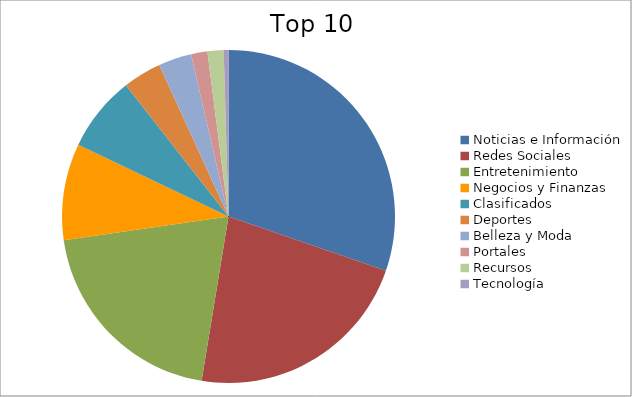
| Category | Series 0 |
|---|---|
| Noticias e Información | 29.61 |
| Redes Sociales | 21.8 |
| Entretenimiento | 19.69 |
| Negocios y Finanzas | 9.17 |
| Clasificados | 7.17 |
| Deportes | 3.66 |
| Belleza y Moda | 3.14 |
| Portales | 1.55 |
| Recursos | 1.53 |
| Tecnología | 0.45 |